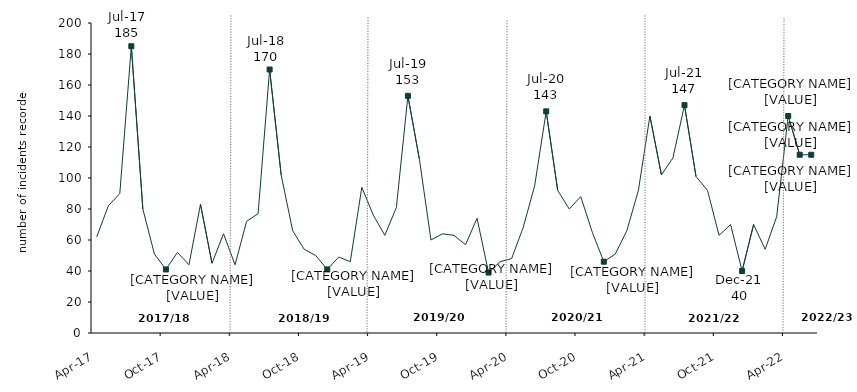
| Category | Series 0 |
|---|---|
| 2017-04-01 | 62 |
| 2017-05-01 | 82 |
| 2017-06-01 | 90 |
| 2017-07-01 | 185 |
| 2017-08-01 | 80 |
| 2017-09-01 | 51 |
| 2017-10-01 | 41 |
| 2017-11-01 | 52 |
| 2017-12-01 | 44 |
| 2018-01-01 | 83 |
| 2018-02-01 | 45 |
| 2018-03-01 | 64 |
| 2018-04-01 | 44 |
| 2018-05-01 | 72 |
| 2018-06-01 | 77 |
| 2018-07-01 | 170 |
| 2018-08-01 | 102 |
| 2018-09-01 | 66 |
| 2018-10-01 | 54 |
| 2018-11-01 | 50 |
| 2018-12-01 | 41 |
| 2019-01-01 | 49 |
| 2019-02-01 | 46 |
| 2019-03-01 | 94 |
| 2019-04-01 | 76 |
| 2019-05-01 | 63 |
| 2019-06-01 | 81 |
| 2019-07-01 | 153 |
| 2019-08-01 | 112 |
| 2019-09-01 | 60 |
| 2019-10-01 | 64 |
| 2019-11-01 | 63 |
| 2019-12-01 | 57 |
| 2020-01-01 | 74 |
| 2020-02-01 | 39 |
| 2020-03-01 | 46 |
| 2020-04-01 | 48 |
| 2020-05-01 | 68 |
| 2020-06-01 | 95 |
| 2020-07-01 | 143 |
| 2020-08-01 | 92 |
| 2020-09-01 | 80 |
| 2020-10-01 | 88 |
| 2020-11-01 | 65 |
| 2020-12-01 | 46 |
| 2021-01-01 | 51 |
| 2021-02-01 | 66 |
| 2021-03-01 | 92 |
| 2021-04-01 | 140 |
| 2021-05-01 | 102 |
| 2021-06-01 | 113 |
| 2021-07-01 | 147 |
| 2021-08-01 | 101 |
| 2021-09-01 | 92 |
| 2021-10-01 | 63 |
| 2021-11-01 | 70 |
| 2021-12-01 | 40 |
| 2022-01-01 | 70 |
| 2022-02-01 | 54 |
| 2022-03-01 | 75 |
| 2022-04-01 | 140 |
| 2022-05-01 | 115 |
| 2022-06-01 | 115 |